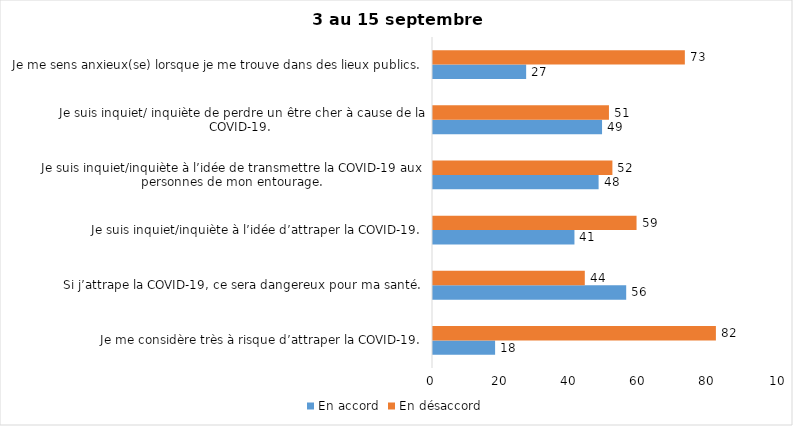
| Category | En accord | En désaccord |
|---|---|---|
| Je me considère très à risque d’attraper la COVID-19. | 18 | 82 |
| Si j’attrape la COVID-19, ce sera dangereux pour ma santé. | 56 | 44 |
| Je suis inquiet/inquiète à l’idée d’attraper la COVID-19. | 41 | 59 |
| Je suis inquiet/inquiète à l’idée de transmettre la COVID-19 aux personnes de mon entourage. | 48 | 52 |
| Je suis inquiet/ inquiète de perdre un être cher à cause de la COVID-19. | 49 | 51 |
| Je me sens anxieux(se) lorsque je me trouve dans des lieux publics. | 27 | 73 |